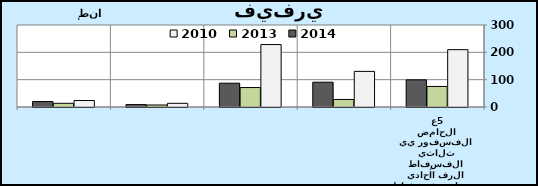
| Category | 2010 | 2013 | 2014 |
|---|---|---|---|
| 0 | 209.762 | 75.196 | 99.301 |
| 1 | 130.309 | 27.555 | 90.72 |
| 2 | 228.4 | 71.179 | 87.094 |
| 3 | 13.49 | 7.34 | 8.82 |
| 4 | 23.675 | 13.604 | 19.928 |